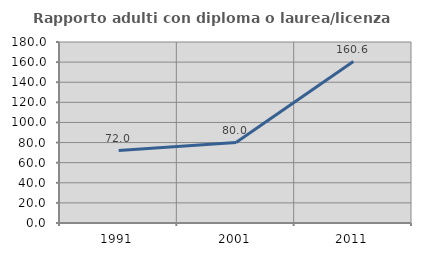
| Category | Rapporto adulti con diploma o laurea/licenza media  |
|---|---|
| 1991.0 | 72 |
| 2001.0 | 80 |
| 2011.0 | 160.606 |